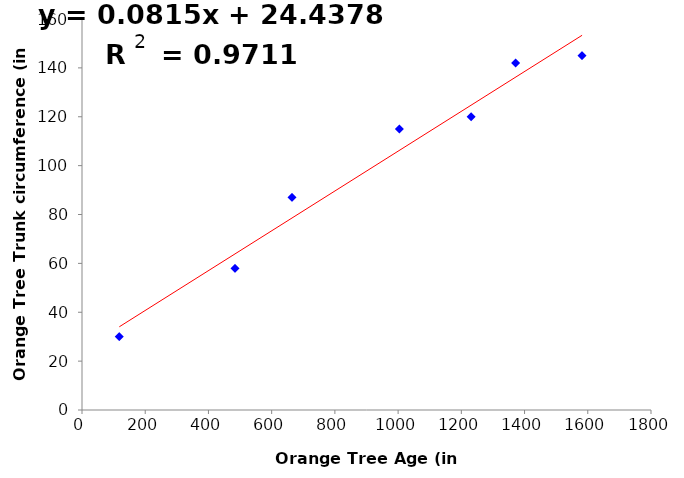
| Category | Orange Tree age (in days) ($x_i$) & Orange Tree Trunk circumference (in mm) ($y_i$) |
|---|---|
| 118.0 | 30 |
| 484.0 | 58 |
| 664.0 | 87 |
| 1004.0 | 115 |
| 1231.0 | 120 |
| 1372.0 | 142 |
| 1582.0 | 145 |